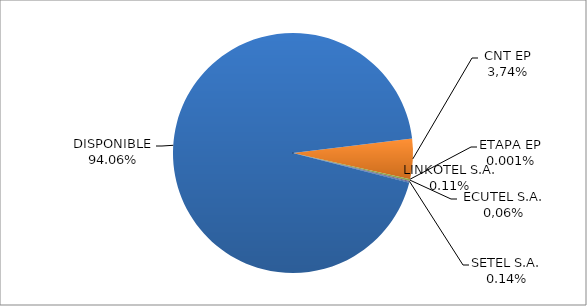
| Category | CODIGO DE AREA 6 |
|---|---|
| CORPORACIÓN NACIONAL TELECOMUNICACIONES CNT EP | 0.054 |
| ETAPA EP | 0 |
| CONECEL (ex ECUADORTELECOM S.A.) | 0.002 |
| SETEL S.A. | 0.001 |
| LINKOTEL S.A. | 0.001 |
| DISPONIBLE | 0.941 |